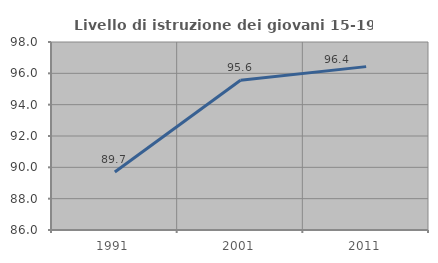
| Category | Livello di istruzione dei giovani 15-19 anni |
|---|---|
| 1991.0 | 89.706 |
| 2001.0 | 95.556 |
| 2011.0 | 96.429 |